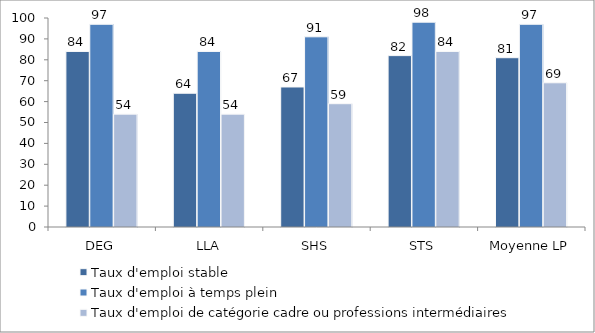
| Category | Taux d'emploi stable | Taux d'emploi à temps plein | Taux d'emploi de catégorie cadre ou professions intermédiaires |
|---|---|---|---|
| DEG | 84 | 97 | 54 |
| LLA | 64 | 84 | 54 |
| SHS | 67 | 91 | 59 |
| STS | 82 | 98 | 84 |
| Moyenne LP | 81 | 97 | 69 |